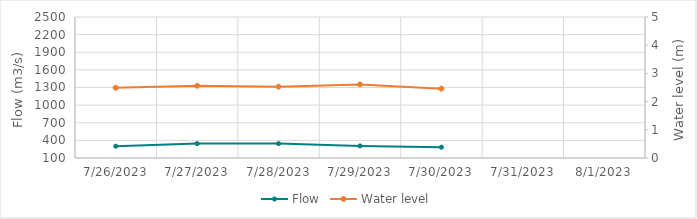
| Category | Flow |
|---|---|
| 5/11/23 | 707.71 |
| 5/10/23 | 675.19 |
| 5/9/23 | 721.38 |
| 5/8/23 | 709.96 |
| 5/7/23 | 610.29 |
| 5/6/23 | 593.21 |
| 5/5/23 | 570.43 |